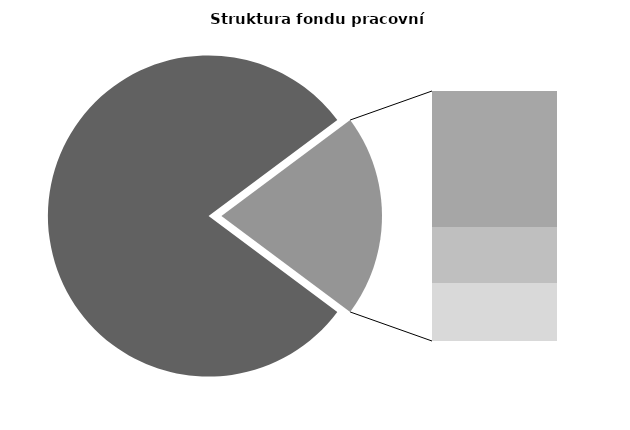
| Category | Series 0 |
|---|---|
| Průměrná měsíční odpracovaná doba bez přesčasu | 136.669 |
| Dovolená | 19.037 |
| Nemoc | 7.842 |
| Jiné | 8.126 |